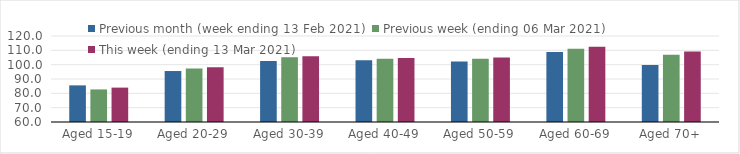
| Category | Previous month (week ending 13 Feb 2021) | Previous week (ending 06 Mar 2021) | This week (ending 13 Mar 2021) |
|---|---|---|---|
| Aged 15-19 | 85.55 | 82.73 | 83.99 |
| Aged 20-29 | 95.56 | 97.34 | 98.19 |
| Aged 30-39 | 102.57 | 105.14 | 105.92 |
| Aged 40-49 | 103.09 | 104.13 | 104.65 |
| Aged 50-59 | 102.21 | 104.17 | 105.02 |
| Aged 60-69 | 108.83 | 111.03 | 112.48 |
| Aged 70+ | 99.82 | 106.91 | 109.24 |